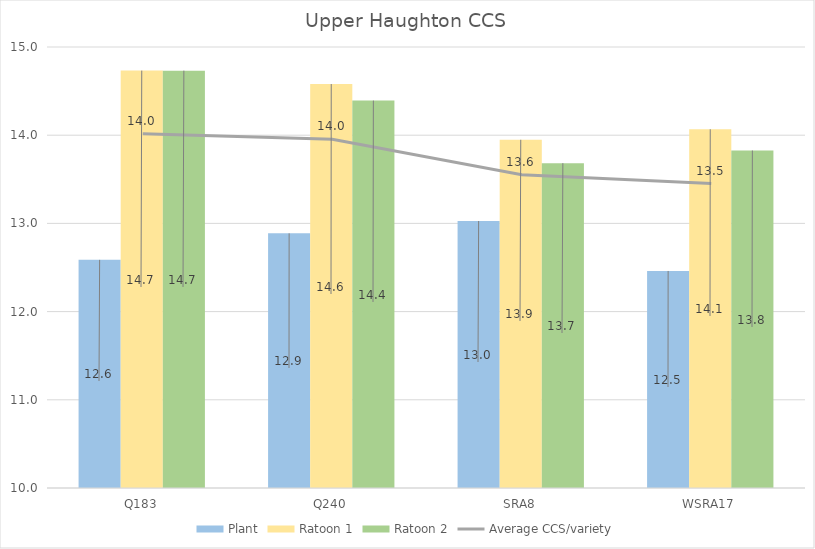
| Category | Plant | Ratoon 1 | Ratoon 2 |
|---|---|---|---|
| Q183 | 12.587 | 14.732 | 14.732 |
| Q240 | 12.887 | 14.58 | 14.393 |
| SRA8 | 13.027 | 13.948 | 13.683 |
| WSRA17 | 12.461 | 14.067 | 13.827 |